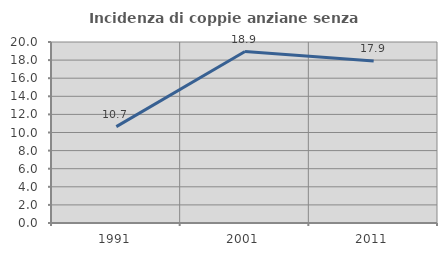
| Category | Incidenza di coppie anziane senza figli  |
|---|---|
| 1991.0 | 10.654 |
| 2001.0 | 18.947 |
| 2011.0 | 17.907 |